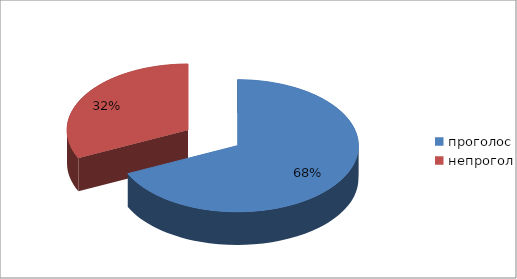
| Category | Series 0 |
|---|---|
| проголос | 83 |
| непрогол | 39 |